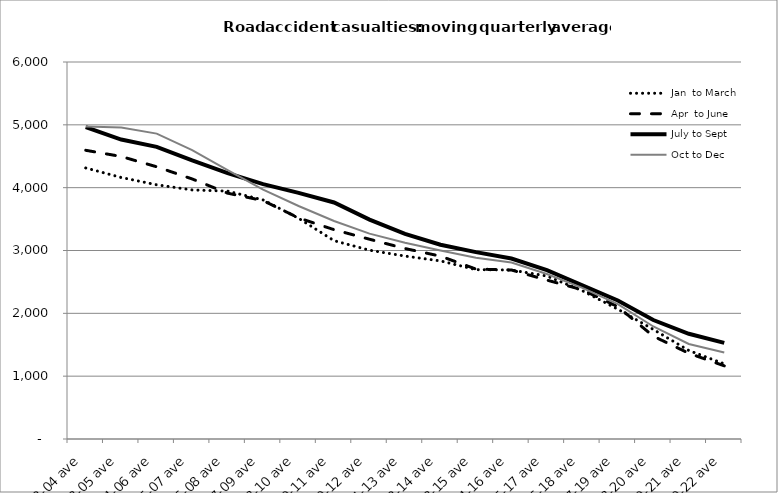
| Category | Jan  to March | Apr  to June | July to Sept | Oct to Dec |
|---|---|---|---|---|
| 2002-04 ave | 4314 | 4594.667 | 4963 | 4972.667 |
| 2003-05 ave | 4161.667 | 4496.333 | 4766 | 4958.667 |
| 2004-06 ave | 4046 | 4332.333 | 4648.667 | 4860 |
| 2005-07 ave | 3963.667 | 4138.667 | 4433 | 4597.333 |
| 2006-08 ave | 3945 | 3912.333 | 4231.667 | 4277.667 |
| 2007-09 ave | 3804.667 | 3793.667 | 4056.333 | 3970 |
| 2008-10 ave | 3512.667 | 3519 | 3917.667 | 3708.333 |
| 2009-11 ave | 3156.333 | 3331.333 | 3764.333 | 3470 |
| 2010-12 ave | 3004.333 | 3179.333 | 3492.333 | 3269 |
| 2011-13 ave | 2911.333 | 3031.333 | 3265 | 3122 |
| 2012-14 ave | 2834.333 | 2910 | 3091 | 3000 |
| 2013-15 ave | 2695.333 | 2704.333 | 2973.667 | 2883.667 |
| 2014-16 ave | 2689.333 | 2690 | 2872 | 2807.667 |
| 2015-17 ave | 2593.333 | 2529 | 2688.333 | 2625.333 |
| 2016-18 ave | 2359.333 | 2374 | 2446.333 | 2405.333 |
| 2017-19 ave | 2065.667 | 2105.667 | 2204 | 2145.667 |
| 2018-20 ave | 1743.333 | 1636 | 1894 | 1790.667 |
| 2019-21 ave | 1408.333 | 1364.667 | 1675 | 1513 |
| 2020-22 ave | 1196 | 1164.333 | 1529.667 | 1376 |